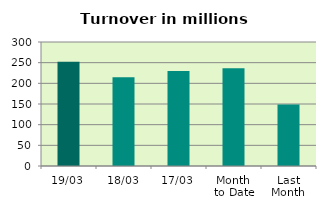
| Category | Series 0 |
|---|---|
| 19/03 | 252.466 |
| 18/03 | 214.584 |
| 17/03 | 229.744 |
| Month 
to Date | 236.632 |
| Last
Month | 148.578 |